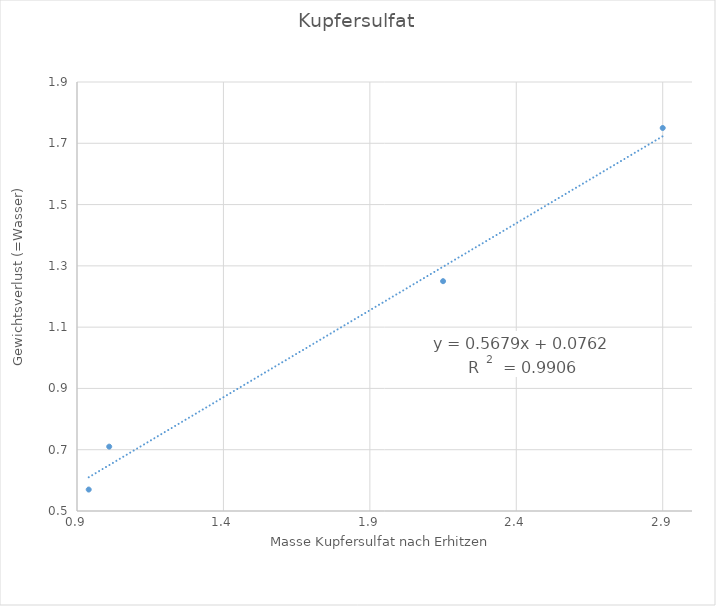
| Category | Series 0 |
|---|---|
| 0.94 | 0.57 |
| 2.15 | 1.25 |
| 1.01 | 0.71 |
| 2.9 | 1.75 |